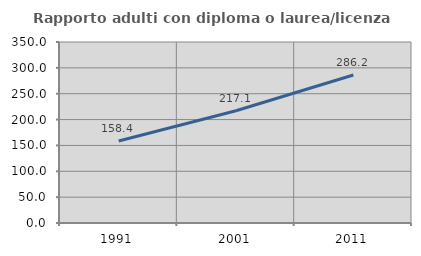
| Category | Rapporto adulti con diploma o laurea/licenza media  |
|---|---|
| 1991.0 | 158.424 |
| 2001.0 | 217.14 |
| 2011.0 | 286.152 |